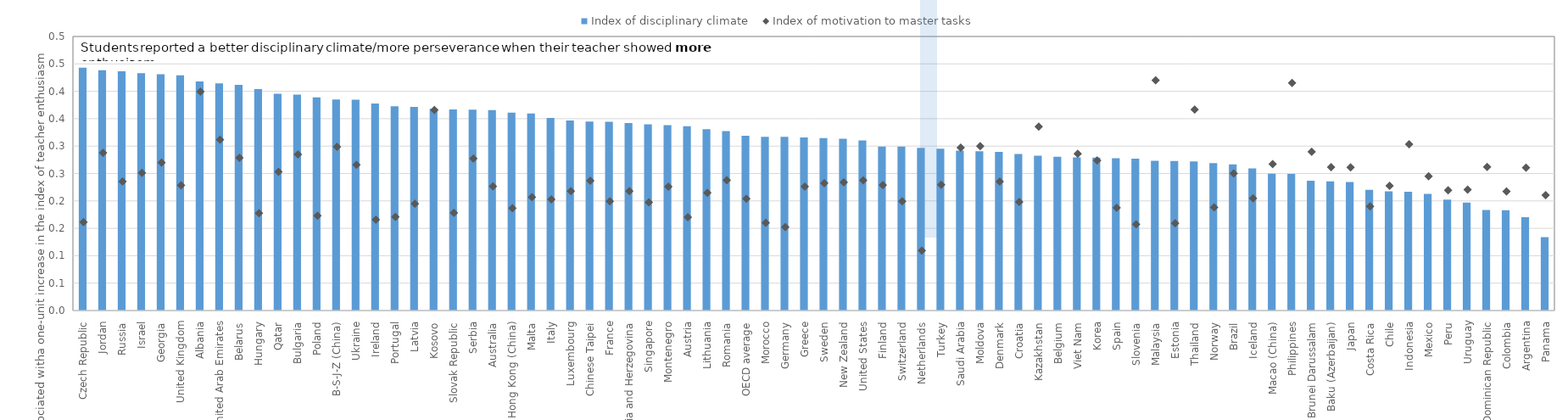
| Category | Index of disciplinary climate, N.S. | Index of disciplinary climate |
|---|---|---|
| Czech Republic |  | 0.443 |
| Jordan |  | 0.438 |
| Russia |  | 0.436 |
| Israel |  | 0.433 |
| Georgia |  | 0.431 |
| United Kingdom |  | 0.429 |
| Albania |  | 0.418 |
| United Arab Emirates |  | 0.415 |
| Belarus |  | 0.412 |
| Hungary |  | 0.404 |
| Qatar |  | 0.396 |
| Bulgaria |  | 0.394 |
| Poland |  | 0.389 |
| B-S-J-Z (China) |  | 0.385 |
| Ukraine |  | 0.385 |
| Ireland |  | 0.378 |
| Portugal |  | 0.373 |
| Latvia |  | 0.372 |
| Kosovo |  | 0.368 |
| Slovak Republic |  | 0.367 |
| Serbia |  | 0.367 |
| Australia |  | 0.366 |
| Hong Kong (China) |  | 0.361 |
| Malta |  | 0.36 |
| Italy |  | 0.351 |
| Luxembourg |  | 0.347 |
| Chinese Taipei |  | 0.345 |
| France |  | 0.345 |
| Bosnia and Herzegovina |  | 0.342 |
| Singapore |  | 0.34 |
| Montenegro |  | 0.338 |
| Austria |  | 0.336 |
| Lithuania |  | 0.331 |
| Romania |  | 0.327 |
| OECD average |  | 0.319 |
| Morocco |  | 0.317 |
| Germany |  | 0.317 |
| Greece |  | 0.316 |
| Sweden |  | 0.314 |
| New Zealand |  | 0.314 |
| United States |  | 0.31 |
| Finland |  | 0.299 |
| Switzerland |  | 0.299 |
| Netherlands |  | 0.297 |
| Turkey |  | 0.295 |
| Saudi Arabia |  | 0.292 |
| Moldova |  | 0.29 |
| Denmark |  | 0.289 |
| Croatia |  | 0.285 |
| Kazakhstan |  | 0.283 |
| Belgium |  | 0.28 |
| Viet Nam |  | 0.279 |
| Korea |  | 0.279 |
| Spain |  | 0.278 |
| Slovenia |  | 0.277 |
| Malaysia |  | 0.273 |
| Estonia |  | 0.273 |
| Thailand |  | 0.272 |
| Norway |  | 0.269 |
| Brazil |  | 0.267 |
| Iceland |  | 0.259 |
| Macao (China) |  | 0.249 |
| Philippines |  | 0.249 |
| Brunei Darussalam |  | 0.237 |
| Baku (Azerbaijan) |  | 0.236 |
| Japan |  | 0.235 |
| Costa Rica |  | 0.22 |
| Chile |  | 0.217 |
| Indonesia |  | 0.217 |
| Mexico |  | 0.213 |
| Peru |  | 0.203 |
| Uruguay |  | 0.197 |
| Dominican Republic |  | 0.183 |
| Colombia |  | 0.183 |
| Argentina |  | 0.17 |
| Panama |  | 0.134 |